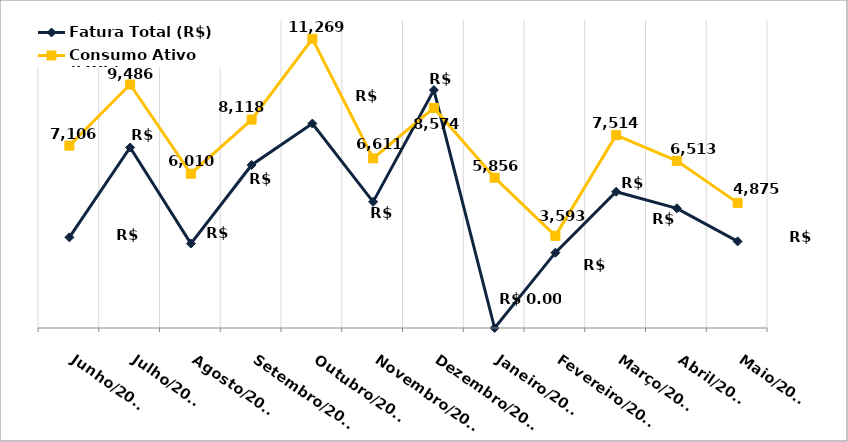
| Category | Fatura Total (R$) | Consumo Ativo (kWh) |
|---|---|---|
| Junho/2023 | 3531.23 | 7106 |
| Julho/2023 | 7031.99 | 9486 |
| Agosto/2023 | 3290.09 | 6010 |
| Setembro/2023 | 6351.56 | 8118 |
| Outubro/2023 | 7964.11 | 11269 |
| Novembro/2023 | 4914.79 | 6611 |
| Dezembro/2023 | 9268.9 | 8574 |
| Janeiro/2024 | 0 | 5856 |
| Fevereiro/2024 | 2934.67 | 3593 |
| Março/2024 | 5306.68 | 7514 |
| Abril/2024 | 4663.31 | 6513 |
| Maio/2024 | 3374.73 | 4875 |